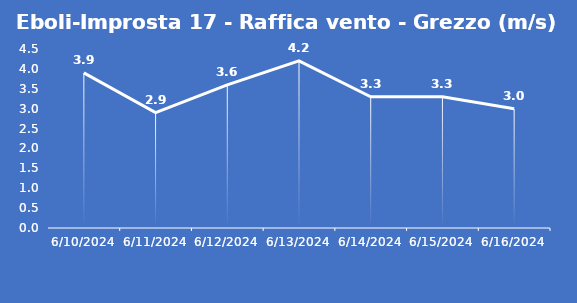
| Category | Eboli-Improsta 17 - Raffica vento - Grezzo (m/s) |
|---|---|
| 6/10/24 | 3.9 |
| 6/11/24 | 2.9 |
| 6/12/24 | 3.6 |
| 6/13/24 | 4.2 |
| 6/14/24 | 3.3 |
| 6/15/24 | 3.3 |
| 6/16/24 | 3 |